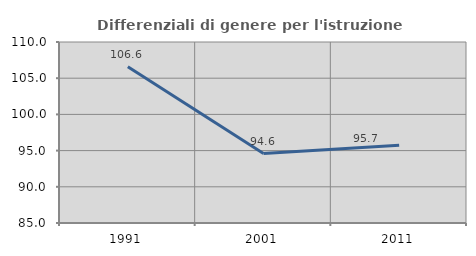
| Category | Differenziali di genere per l'istruzione superiore |
|---|---|
| 1991.0 | 106.575 |
| 2001.0 | 94.593 |
| 2011.0 | 95.737 |